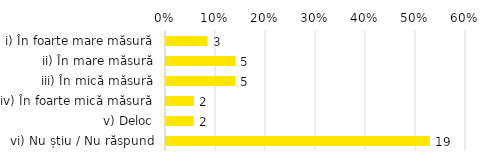
| Category | Total |
|---|---|
| i) În foarte mare măsură | 0.083 |
| ii) În mare măsură | 0.139 |
| iii) În mică măsură | 0.139 |
| iv) În foarte mică măsură | 0.056 |
| v) Deloc | 0.056 |
| vi) Nu știu / Nu răspund | 0.528 |